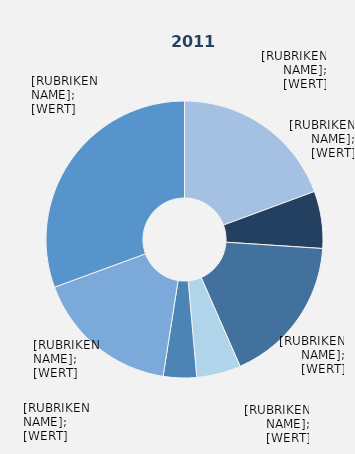
| Category | Series 1 |
|---|---|
| Produzierendes Gewerbe ohne Baugewerbe | 0.194 |
| Baugewerbe | 0.067 |
| Handel | 0.174 |
| Verkehr und Lagerei | 0.052 |
| Gastgewerbe | 0.039 |
| Erbringung von Unternehmens-dienstleistungen | 0.169 |
| Erbringung von öffentlichen und privaten Dienstleistungen | 0.306 |